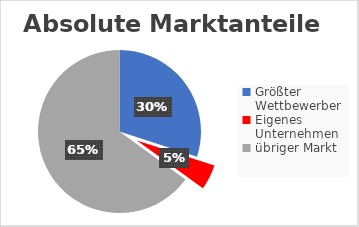
| Category | Series 0 |
|---|---|
| Größter Wettbewerber | 300 |
| Eigenes Unternehmen | 50 |
| übriger Markt | 650 |